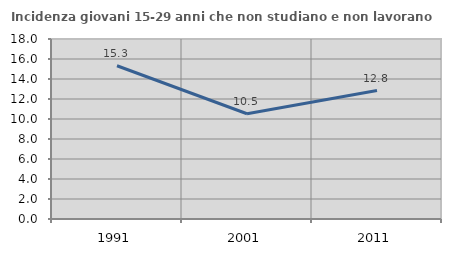
| Category | Incidenza giovani 15-29 anni che non studiano e non lavorano  |
|---|---|
| 1991.0 | 15.328 |
| 2001.0 | 10.526 |
| 2011.0 | 12.844 |